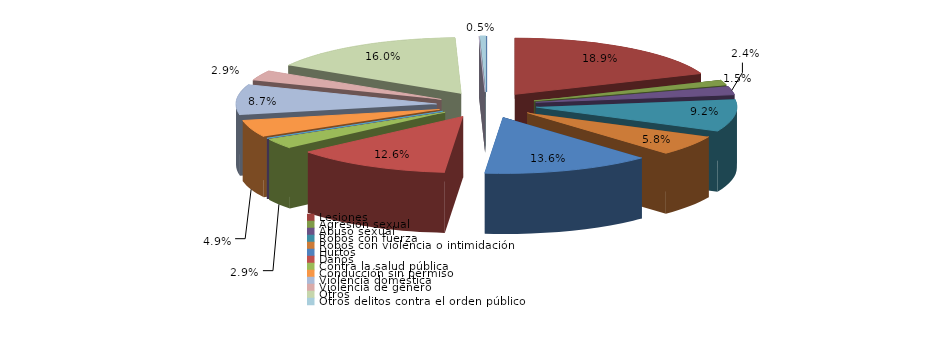
| Category | Series 0 |
|---|---|
| Homicidio/Asesinato dolosos | 0 |
| Lesiones | 39 |
| Agresión sexual | 3 |
| Abuso sexual | 5 |
| Robos con fuerza | 19 |
| Robos con violencia o intimidación | 12 |
| Hurtos | 28 |
| Daños | 26 |
| Contra la salud pública | 6 |
| Conduccción etílica/drogas | 0 |
| Conducción temeraria | 0 |
| Conducción sin permiso | 10 |
| Violencia doméstica | 18 |
| Violencia de género | 6 |
| Otros | 33 |
| Atentados y delitos de resistencia y desobediencia grave | 0 |
| Otros delitos contra el orden público | 1 |